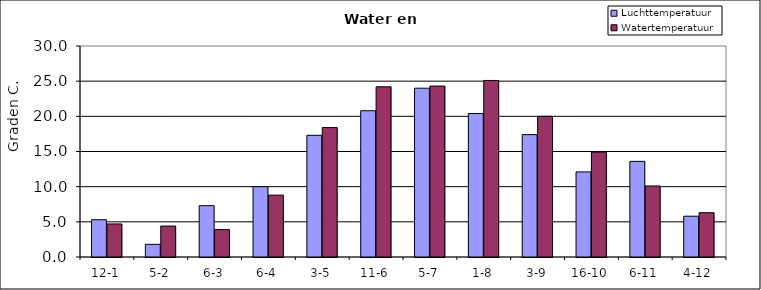
| Category | Luchttemperatuur | Watertemperatuur |
|---|---|---|
| 12-1 | 5.3 | 4.7 |
| 5-2 | 1.8 | 4.4 |
| 6-3 | 7.3 | 3.9 |
| 6-4 | 10 | 8.8 |
| 3-5 | 17.3 | 18.4 |
| 11-6 | 20.8 | 24.2 |
| 5-7 | 24 | 24.3 |
| 1-8 | 20.4 | 25.1 |
| 3-9 | 17.4 | 20 |
| 16-10 | 12.1 | 14.9 |
| 6-11 | 13.6 | 10.1 |
| 4-12 | 5.8 | 6.3 |